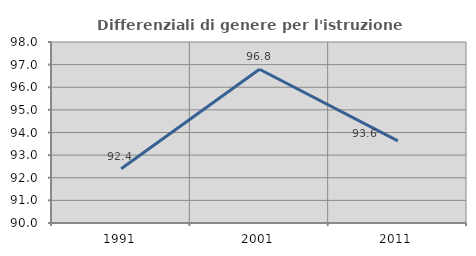
| Category | Differenziali di genere per l'istruzione superiore |
|---|---|
| 1991.0 | 92.395 |
| 2001.0 | 96.797 |
| 2011.0 | 93.627 |